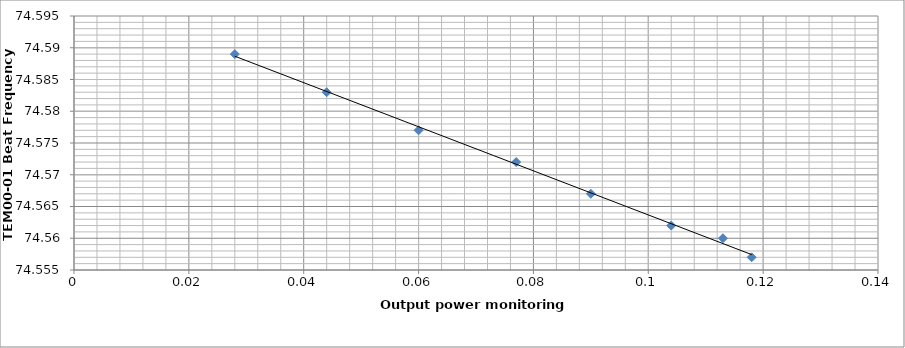
| Category | Series 0 |
|---|---|
| 0.118 | 74.557 |
| 0.113 | 74.56 |
| 0.104 | 74.562 |
| 0.09 | 74.567 |
| 0.077 | 74.572 |
| 0.06 | 74.577 |
| 0.044 | 74.583 |
| 0.028 | 74.589 |